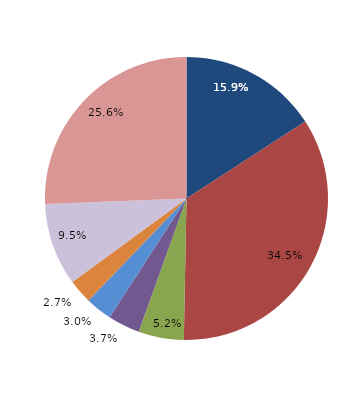
| Category | Series 0 |
|---|---|
| قبل الدخول
Before Consummation | 15.854 |
| -1 | 34.451 |
| 1 | 5.183 |
| 2 | 3.659 |
| 3 | 3.049 |
| 4 | 2.744 |
|  5 - 9 | 9.451 |
| 10+ | 25.61 |